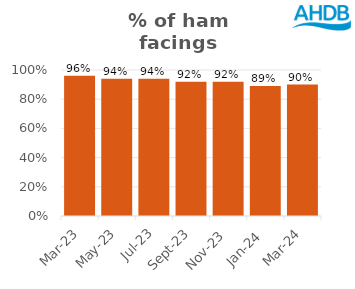
| Category | Ham |
|---|---|
| 2023-03-01 | 0.96 |
| 2023-05-01 | 0.94 |
| 2023-07-01 | 0.94 |
| 2023-09-01 | 0.92 |
| 2023-11-01 | 0.92 |
| 2024-01-01 | 0.89 |
| 2024-03-01 | 0.9 |